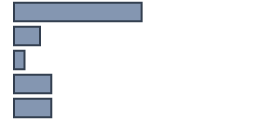
| Category | 47.1 |
|---|---|
| 0 | 53.4 |
| 1 | 10.9 |
| 2 | 4.4 |
| 3 | 15.6 |
| 4 | 15.6 |